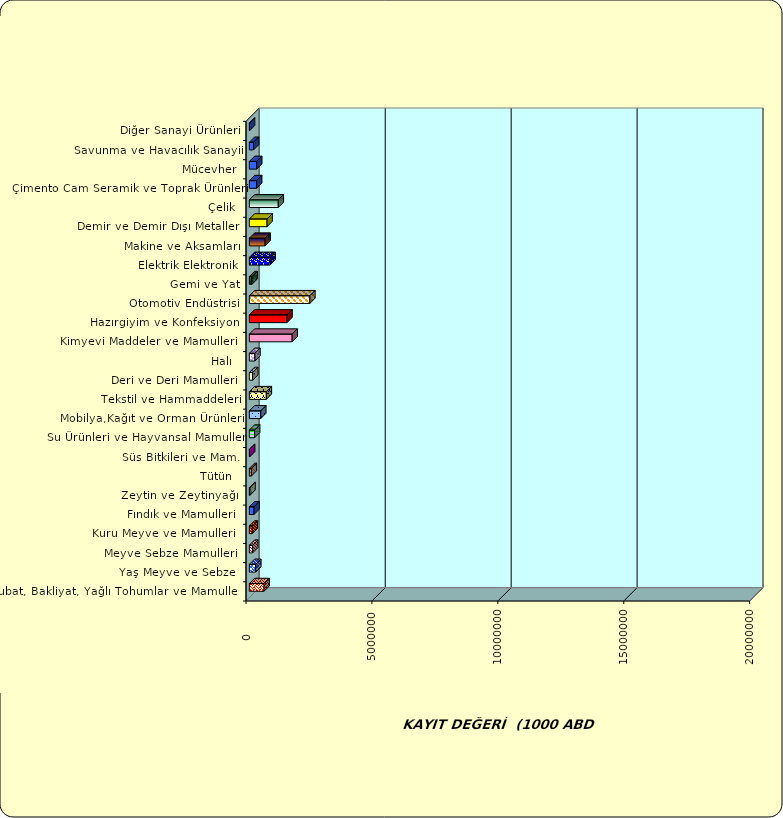
| Category | Series 0 |
|---|---|
|  Hububat, Bakliyat, Yağlı Tohumlar ve Mamulleri  | 584373.303 |
|  Yaş Meyve ve Sebze   | 256226.968 |
|  Meyve Sebze Mamulleri  | 132244.253 |
|  Kuru Meyve ve Mamulleri   | 114115.282 |
|  Fındık ve Mamulleri  | 185182.077 |
|  Zeytin ve Zeytinyağı  | 24451.569 |
|  Tütün  | 79131.446 |
|  Süs Bitkileri ve Mam. | 11024.011 |
|  Su Ürünleri ve Hayvansal Mamuller | 209750.454 |
|  Mobilya,Kağıt ve Orman Ürünleri | 453783.843 |
|  Tekstil ve Hammaddeleri | 673702.034 |
|  Deri ve Deri Mamulleri  | 133437.779 |
|  Halı  | 221658.424 |
|  Kimyevi Maddeler ve Mamulleri   | 1700258.175 |
|  Hazırgiyim ve Konfeksiyon  | 1495474.895 |
|  Otomotiv Endüstrisi | 2402323.451 |
|  Gemi ve Yat | 108772.346 |
|  Elektrik Elektronik | 824784.234 |
|  Makine ve Aksamları | 625772.079 |
|  Demir ve Demir Dışı Metaller  | 702899.949 |
|  Çelik | 1148221.446 |
|  Çimento Cam Seramik ve Toprak Ürünleri | 288446.031 |
|  Mücevher | 291972.467 |
|  Savunma ve Havacılık Sanayii | 166947.046 |
|  Diğer Sanayi Ürünleri | 7217.262 |